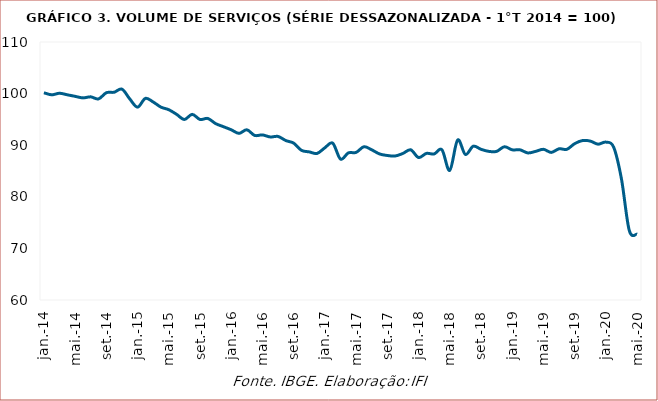
| Category | Volume de serviços |
|---|---|
| 2014-01-01 | 100.166 |
| 2014-02-01 | 99.767 |
| 2014-03-01 | 100.066 |
| 2014-04-01 | 99.767 |
| 2014-05-01 | 99.468 |
| 2014-06-01 | 99.169 |
| 2014-07-01 | 99.369 |
| 2014-08-01 | 98.97 |
| 2014-09-01 | 100.166 |
| 2014-10-01 | 100.266 |
| 2014-11-01 | 100.864 |
| 2014-12-01 | 98.97 |
| 2015-01-01 | 97.375 |
| 2015-02-01 | 99.07 |
| 2015-03-01 | 98.372 |
| 2015-04-01 | 97.375 |
| 2015-05-01 | 96.877 |
| 2015-06-01 | 95.98 |
| 2015-07-01 | 94.983 |
| 2015-08-01 | 95.98 |
| 2015-09-01 | 94.983 |
| 2015-10-01 | 95.183 |
| 2015-11-01 | 94.186 |
| 2015-12-01 | 93.588 |
| 2016-01-01 | 92.99 |
| 2016-02-01 | 92.292 |
| 2016-03-01 | 92.99 |
| 2016-04-01 | 91.894 |
| 2016-05-01 | 91.993 |
| 2016-06-01 | 91.595 |
| 2016-07-01 | 91.694 |
| 2016-08-01 | 90.897 |
| 2016-09-01 | 90.399 |
| 2016-10-01 | 89.003 |
| 2016-11-01 | 88.704 |
| 2016-12-01 | 88.405 |
| 2017-01-01 | 89.502 |
| 2017-02-01 | 90.399 |
| 2017-03-01 | 87.309 |
| 2017-04-01 | 88.505 |
| 2017-05-01 | 88.605 |
| 2017-06-01 | 89.701 |
| 2017-07-01 | 89.103 |
| 2017-08-01 | 88.306 |
| 2017-09-01 | 88.007 |
| 2017-10-01 | 87.907 |
| 2017-11-01 | 88.405 |
| 2017-12-01 | 89.103 |
| 2018-01-01 | 87.608 |
| 2018-02-01 | 88.405 |
| 2018-03-01 | 88.306 |
| 2018-04-01 | 89.103 |
| 2018-05-01 | 85.116 |
| 2018-06-01 | 90.997 |
| 2018-07-01 | 88.206 |
| 2018-08-01 | 89.801 |
| 2018-09-01 | 89.203 |
| 2018-10-01 | 88.804 |
| 2018-11-01 | 88.804 |
| 2018-12-01 | 89.701 |
| 2019-01-01 | 89.103 |
| 2019-02-01 | 89.103 |
| 2019-03-01 | 88.505 |
| 2019-04-01 | 88.804 |
| 2019-05-01 | 89.203 |
| 2019-06-01 | 88.605 |
| 2019-07-01 | 89.302 |
| 2019-08-01 | 89.203 |
| 2019-09-01 | 90.299 |
| 2019-10-01 | 90.897 |
| 2019-11-01 | 90.797 |
| 2019-12-01 | 90.199 |
| 2020-01-01 | 90.598 |
| 2020-02-01 | 89.601 |
| 2020-03-01 | 83.422 |
| 2020-04-01 | 73.455 |
| 2020-05-01 | 72.757 |